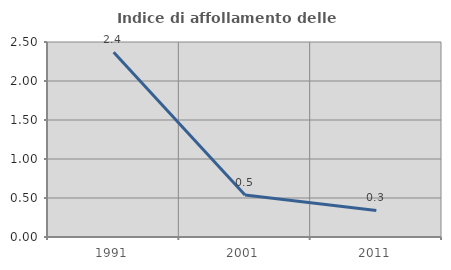
| Category | Indice di affollamento delle abitazioni  |
|---|---|
| 1991.0 | 2.369 |
| 2001.0 | 0.538 |
| 2011.0 | 0.34 |